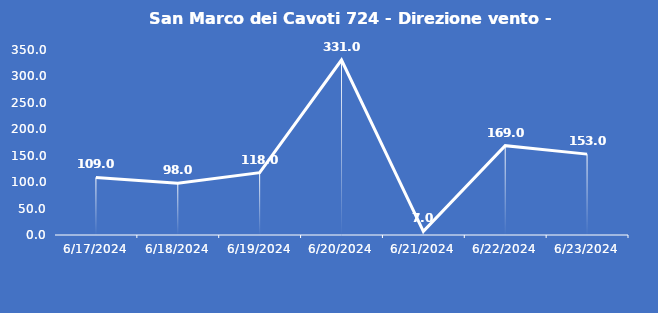
| Category | San Marco dei Cavoti 724 - Direzione vento - Grezzo (°N) |
|---|---|
| 6/17/24 | 109 |
| 6/18/24 | 98 |
| 6/19/24 | 118 |
| 6/20/24 | 331 |
| 6/21/24 | 7 |
| 6/22/24 | 169 |
| 6/23/24 | 153 |